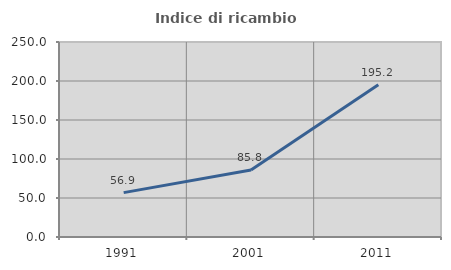
| Category | Indice di ricambio occupazionale  |
|---|---|
| 1991.0 | 56.884 |
| 2001.0 | 85.833 |
| 2011.0 | 195.246 |